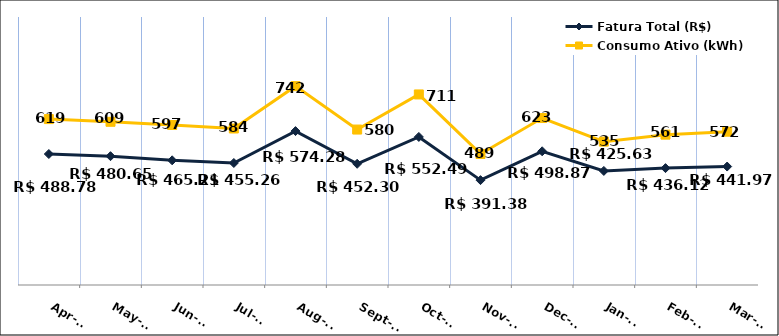
| Category | Fatura Total (R$) |
|---|---|
| 2023-04-01 | 488.78 |
| 2023-05-01 | 480.65 |
| 2023-06-01 | 465.21 |
| 2023-07-01 | 455.26 |
| 2023-08-01 | 574.28 |
| 2023-09-01 | 452.3 |
| 2023-10-01 | 552.49 |
| 2023-11-01 | 391.38 |
| 2023-12-01 | 498.87 |
| 2024-01-01 | 425.63 |
| 2024-02-01 | 436.12 |
| 2024-03-01 | 441.97 |